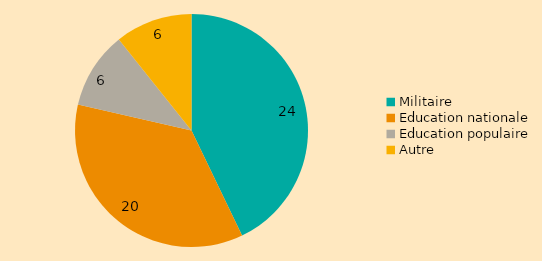
| Category | Series 0 |
|---|---|
| Militaire | 24 |
| Education nationale | 20 |
| Education populaire | 6 |
| Autre | 6 |